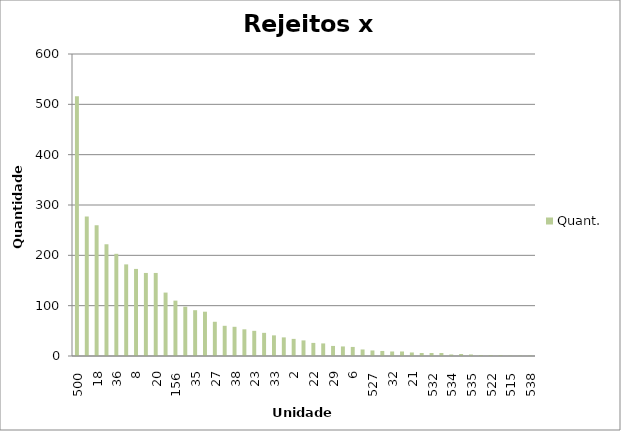
| Category | Quant. |
|---|---|
| 500.0 | 516 |
| 3.0 | 277 |
| 18.0 | 260 |
| 30.0 | 222 |
| 36.0 | 203 |
| 10.0 | 182 |
| 8.0 | 173 |
| 26.0 | 165 |
| 20.0 | 165 |
| 9.0 | 126 |
| 156.0 | 110 |
| 25.0 | 98 |
| 35.0 | 91 |
| 15.0 | 88 |
| 27.0 | 68 |
| 11.0 | 60 |
| 38.0 | 58 |
| 31.0 | 53 |
| 23.0 | 50 |
| 37.0 | 46 |
| 33.0 | 41 |
| 542.0 | 37 |
| 2.0 | 34 |
| 5.0 | 31 |
| 22.0 | 26 |
| 4.0 | 25 |
| 29.0 | 20 |
| 72.0 | 19 |
| 6.0 | 18 |
| 501.0 | 13 |
| 527.0 | 11 |
| 524.0 | 10 |
| 32.0 | 9 |
| 503.0 | 9 |
| 21.0 | 7 |
| 14.0 | 6 |
| 532.0 | 6 |
| 16.0 | 6 |
| 534.0 | 3 |
| 529.0 | 4 |
| 535.0 | 3 |
| 147.0 | 2 |
| 522.0 | 2 |
| 531.0 | 2 |
| 515.0 | 1 |
| 523.0 | 1 |
| 538.0 | 1 |